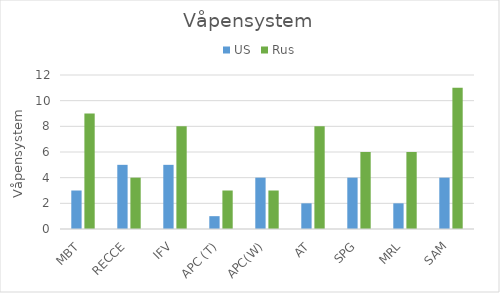
| Category | US | Rus |
|---|---|---|
| MBT | 3 | 9 |
| RECCE | 5 | 4 |
| IFV | 5 | 8 |
| APC (T) | 1 | 3 |
| APC(W) | 4 | 3 |
| AT | 2 | 8 |
| SPG | 4 | 6 |
| MRL | 2 | 6 |
| SAM | 4 | 11 |